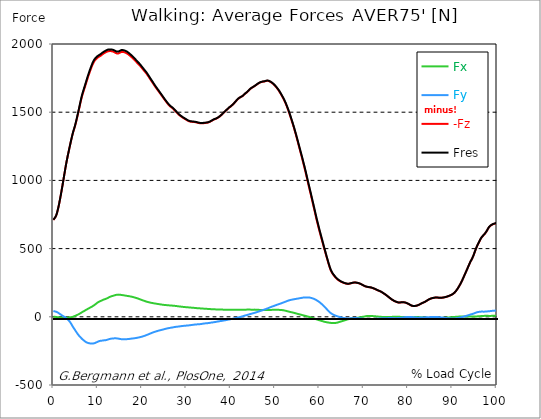
| Category |  Fx |  Fy |  -Fz |  Fres |
|---|---|---|---|---|
| 0.0 | 0.979 | 42.107 | 709.918 | 711.314 |
| 0.1646090534979424 | 0.453 | 40.911 | 717.196 | 718.51 |
| 0.3292181069958848 | -0.073 | 39.723 | 724.482 | 725.706 |
| 0.5041152263374485 | -0.58 | 38.382 | 732.703 | 733.826 |
| 0.668724279835391 | -1.169 | 36.669 | 745.355 | 746.379 |
| 0.8333333333333333 | -2.085 | 34.322 | 762.321 | 763.218 |
| 0.9979423868312757 | -3.1 | 31.258 | 783.664 | 784.434 |
| 1.162551440329218 | -4.133 | 27.914 | 806.965 | 807.609 |
| 1.337448559670782 | -5.075 | 24.135 | 833.71 | 834.245 |
| 1.5020576131687242 | -5.945 | 20.247 | 861.443 | 861.887 |
| 1.6666666666666665 | -6.435 | 16.286 | 890.798 | 891.143 |
| 1.831275720164609 | -6.815 | 12.561 | 921.404 | 921.676 |
| 1.9958847736625513 | -7.232 | 8.954 | 952.137 | 952.355 |
| 2.170781893004115 | -7.096 | 5.556 | 984.239 | 984.411 |
| 2.3353909465020575 | -6.942 | 2.42 | 1016.838 | 1016.992 |
| 2.4999999999999996 | -6.761 | -0.816 | 1048.74 | 1048.876 |
| 2.6646090534979425 | -6.625 | -4.133 | 1080.742 | 1080.887 |
| 2.829218106995885 | -6.426 | -7.658 | 1111.864 | 1112.028 |
| 3.0041152263374484 | -6.19 | -11.963 | 1140.939 | 1141.165 |
| 3.168724279835391 | -5.818 | -16.894 | 1168.237 | 1168.545 |
| 3.333333333333333 | -5.302 | -22.277 | 1193.794 | 1194.22 |
| 3.497942386831276 | -4.74 | -28.014 | 1218.863 | 1219.416 |
| 3.662551440329218 | -4.142 | -34.385 | 1243.94 | 1244.683 |
| 3.837448559670782 | -3.399 | -41.889 | 1268.682 | 1269.716 |
| 4.002057613168724 | -2.61 | -50.345 | 1292.681 | 1294.077 |
| 4.166666666666667 | -1.668 | -59.508 | 1315.557 | 1317.36 |
| 4.3312757201646095 | -0.562 | -69.015 | 1337.761 | 1339.972 |
| 4.495884773662552 | 1.069 | -78.124 | 1357.736 | 1360.401 |
| 4.670781893004115 | 3.362 | -86.253 | 1375.01 | 1378.164 |
| 4.835390946502058 | 5.646 | -94.383 | 1392.275 | 1395.928 |
| 4.999999999999999 | 8.075 | -102.567 | 1412.214 | 1416.41 |
| 5.164609053497943 | 10.477 | -110.741 | 1434.11 | 1438.85 |
| 5.329218106995885 | 12.815 | -118.907 | 1457.022 | 1462.324 |
| 5.504115226337448 | 15.462 | -126.529 | 1480.323 | 1486.205 |
| 5.668724279835391 | 18.135 | -133.734 | 1503.95 | 1510.385 |
| 5.833333333333333 | 21.017 | -140.369 | 1528.285 | 1535.245 |
| 5.997942386831276 | 24.044 | -146.695 | 1552.99 | 1560.449 |
| 6.162551440329218 | 27.679 | -151.924 | 1577.433 | 1585.355 |
| 6.337448559670782 | 31.032 | -157.616 | 1600.091 | 1608.529 |
| 6.502057613168724 | 34.304 | -163.126 | 1620.664 | 1629.573 |
| 6.666666666666666 | 37.566 | -167.811 | 1639.098 | 1648.433 |
| 6.831275720164609 | 40.648 | -172.261 | 1656.608 | 1666.351 |
| 6.995884773662552 | 43.539 | -176.53 | 1673.438 | 1683.571 |
| 7.170781893004115 | 46.729 | -180.971 | 1690.486 | 1700.999 |
| 7.3353909465020575 | 49.892 | -185.013 | 1707.697 | 1718.572 |
| 7.500000000000001 | 52.983 | -187.768 | 1725.379 | 1736.526 |
| 7.664609053497942 | 56.146 | -190.07 | 1742.961 | 1754.344 |
| 7.829218106995885 | 59.191 | -191.792 | 1759.719 | 1771.265 |
| 8.004115226337449 | 62.2 | -193.279 | 1775.57 | 1787.279 |
| 8.168724279835391 | 65.218 | -194.62 | 1791.158 | 1803.013 |
| 8.333333333333334 | 68.064 | -195.336 | 1806.285 | 1818.221 |
| 8.497942386831278 | 70.909 | -195.617 | 1820.976 | 1832.948 |
| 8.662551440329219 | 73.719 | -195.653 | 1835.314 | 1847.313 |
| 8.837448559670783 | 76.918 | -195.535 | 1848.219 | 1860.255 |
| 9.002057613168725 | 80.498 | -195.327 | 1859.802 | 1871.892 |
| 9.166666666666668 | 84.259 | -194.611 | 1870.116 | 1882.233 |
| 9.33127572016461 | 88.066 | -192.907 | 1878.191 | 1890.281 |
| 9.495884773662551 | 92.334 | -190.542 | 1884.472 | 1896.507 |
| 9.670781893004117 | 96.476 | -187.995 | 1890.209 | 1902.19 |
| 9.83539094650206 | 100.455 | -185.439 | 1895.755 | 1907.682 |
| 9.999999999999998 | 104.878 | -182.775 | 1900.323 | 1912.223 |
| 10.16460905349794 | 108.421 | -180.464 | 1904.311 | 1916.174 |
| 10.329218106995887 | 111.412 | -178.497 | 1907.465 | 1919.319 |
| 10.504115226337447 | 114.131 | -176.693 | 1910.202 | 1922.065 |
| 10.66872427983539 | 116.225 | -175.859 | 1913.836 | 1925.745 |
| 10.833333333333334 | 118.218 | -175.307 | 1917.978 | 1929.941 |
| 10.997942386831275 | 120.385 | -174.808 | 1922.727 | 1934.744 |
| 11.162551440329217 | 123.103 | -173.784 | 1926.778 | 1938.832 |
| 11.337448559670783 | 126.294 | -172.153 | 1930.222 | 1942.303 |
| 11.502057613168724 | 128.197 | -171.89 | 1932.161 | 1944.324 |
| 11.666666666666666 | 129.574 | -171.99 | 1936.367 | 1948.584 |
| 11.831275720164609 | 131.387 | -171.346 | 1939.965 | 1952.209 |
| 11.995884773662551 | 133.907 | -169.923 | 1942.693 | 1954.955 |
| 12.170781893004115 | 136.78 | -168.083 | 1944.759 | 1957.039 |
| 12.335390946502057 | 139.181 | -166.615 | 1946.572 | 1958.879 |
| 12.5 | 142.426 | -164.503 | 1947.668 | 1960.003 |
| 12.664609053497943 | 144.891 | -162.936 | 1948.176 | 1960.574 |
| 12.829218106995885 | 147.293 | -161.476 | 1948.248 | 1960.71 |
| 13.004115226337449 | 149.314 | -160.643 | 1947.85 | 1960.42 |
| 13.168724279835391 | 151.063 | -159.727 | 1946.871 | 1959.505 |
| 13.333333333333332 | 152.703 | -158.966 | 1945.629 | 1958.326 |
| 13.497942386831276 | 154.28 | -158.467 | 1943.907 | 1956.704 |
| 13.662551440329217 | 155.83 | -158.114 | 1941.841 | 1954.747 |
| 13.837448559670783 | 157.507 | -158.005 | 1938.85 | 1951.91 |
| 14.002057613168724 | 159.328 | -157.942 | 1935.424 | 1948.647 |
| 14.166666666666666 | 160.933 | -158.014 | 1932.488 | 1945.865 |
| 14.33127572016461 | 161.785 | -158.431 | 1930.53 | 1944.025 |
| 14.495884773662551 | 162.22 | -158.984 | 1930.14 | 1943.726 |
| 14.670781893004115 | 162.573 | -159.89 | 1931.065 | 1944.741 |
| 14.835390946502057 | 162.356 | -161.05 | 1933.149 | 1946.88 |
| 15.000000000000002 | 161.757 | -162.211 | 1936.113 | 1949.862 |
| 15.164609053497943 | 161.078 | -163.235 | 1939.357 | 1953.115 |
| 15.329218106995883 | 160.171 | -164.087 | 1941.442 | 1955.163 |
| 15.504115226337449 | 159.492 | -164.703 | 1942.049 | 1955.771 |
| 15.66872427983539 | 158.576 | -165.084 | 1941.904 | 1955.58 |
| 15.833333333333334 | 157.724 | -165.129 | 1941.125 | 1954.737 |
| 15.997942386831276 | 156.981 | -165.102 | 1939.557 | 1953.115 |
| 16.162551440329217 | 155.885 | -165.038 | 1937.645 | 1951.121 |
| 16.337448559670783 | 154.815 | -164.703 | 1935.361 | 1948.747 |
| 16.502057613168724 | 153.882 | -164.159 | 1932.886 | 1946.173 |
| 16.666666666666668 | 153.157 | -163.787 | 1929.714 | 1942.937 |
| 16.83127572016461 | 152.404 | -163.207 | 1925.899 | 1939.031 |
| 16.995884773662556 | 151.471 | -162.591 | 1921.775 | 1934.817 |
| 17.170781893004115 | 150.592 | -161.975 | 1917.253 | 1930.204 |
| 17.33539094650206 | 149.504 | -161.241 | 1912.612 | 1925.446 |
| 17.500000000000004 | 148.471 | -160.479 | 1908.036 | 1920.76 |
| 17.66460905349794 | 147.32 | -159.782 | 1903.296 | 1915.911 |
| 17.82921810699589 | 145.988 | -159.12 | 1898.447 | 1910.936 |
| 18.00411522633745 | 144.61 | -158.504 | 1893.444 | 1905.797 |
| 18.16872427983539 | 143.196 | -157.86 | 1888.36 | 1900.586 |
| 18.333333333333336 | 141.565 | -157.072 | 1882.695 | 1894.767 |
| 18.497942386831276 | 139.979 | -156.247 | 1876.65 | 1888.577 |
| 18.66255144032922 | 138.438 | -155.277 | 1870.469 | 1882.242 |
| 18.837448559670786 | 136.771 | -154.208 | 1864.551 | 1876.152 |
| 19.002057613168724 | 134.994 | -153.129 | 1858.923 | 1870.333 |
| 19.166666666666668 | 132.873 | -152.123 | 1853.793 | 1864.995 |
| 19.331275720164612 | 130.762 | -150.99 | 1848.274 | 1859.267 |
| 19.495884773662553 | 128.704 | -149.758 | 1842.274 | 1853.059 |
| 19.67078189300412 | 126.674 | -148.489 | 1835.975 | 1846.552 |
| 19.83539094650206 | 124.59 | -147.13 | 1829.513 | 1839.872 |
| 19.999999999999996 | 122.677 | -145.571 | 1822.807 | 1832.948 |
| 20.164609053497944 | 120.774 | -143.876 | 1815.991 | 1825.915 |
| 20.32921810699588 | 118.853 | -142.127 | 1809.348 | 1819.054 |
| 20.504115226337447 | 116.913 | -140.233 | 1802.641 | 1812.112 |
| 20.66872427983539 | 115.046 | -138.275 | 1796.388 | 1805.623 |
| 20.833333333333332 | 113.252 | -136.308 | 1790.252 | 1799.252 |
| 20.997942386831276 | 111.276 | -134.251 | 1783.437 | 1792.173 |
| 21.162551440329217 | 109.69 | -132.121 | 1775.932 | 1784.443 |
| 21.33744855967078 | 108.195 | -129.874 | 1767.839 | 1776.123 |
| 21.502057613168724 | 106.872 | -127.644 | 1759.818 | 1767.884 |
| 21.666666666666668 | 105.566 | -125.36 | 1751.489 | 1759.356 |
| 21.83127572016461 | 104.252 | -122.832 | 1742.898 | 1750.547 |
| 21.99588477366255 | 102.993 | -120.511 | 1734.596 | 1742.037 |
| 22.170781893004115 | 101.832 | -118.409 | 1726.693 | 1733.952 |
| 22.335390946502056 | 100.808 | -116.306 | 1718.853 | 1725.941 |
| 22.5 | 99.82 | -114.285 | 1710.842 | 1717.757 |
| 22.664609053497944 | 98.833 | -112.391 | 1702.63 | 1709.401 |
| 22.82921810699588 | 97.963 | -110.606 | 1694.528 | 1701.153 |
| 23.004115226337447 | 97.156 | -108.965 | 1686.58 | 1693.087 |
| 23.16872427983539 | 96.177 | -107.225 | 1678.559 | 1684.93 |
| 23.333333333333332 | 95.289 | -105.521 | 1671.019 | 1677.263 |
| 23.497942386831276 | 94.328 | -103.745 | 1664.258 | 1670.357 |
| 23.662551440329217 | 93.44 | -102.104 | 1656.681 | 1662.653 |
| 23.83744855967078 | 92.624 | -100.582 | 1648.959 | 1654.814 |
| 24.002057613168727 | 91.8 | -99.259 | 1641.555 | 1647.319 |
| 24.166666666666664 | 90.93 | -97.899 | 1634.114 | 1639.769 |
| 24.33127572016461 | 90.041 | -96.494 | 1626.691 | 1632.238 |
| 24.495884773662553 | 89.235 | -95.071 | 1619.024 | 1624.471 |
| 24.670781893004115 | 88.419 | -93.757 | 1611.511 | 1616.858 |
| 24.83539094650206 | 87.676 | -92.398 | 1603.961 | 1609.209 |
| 25.0 | 87.042 | -91.002 | 1596.421 | 1601.577 |
| 25.164609053497944 | 86.534 | -89.543 | 1588.916 | 1593.992 |
| 25.329218106995885 | 86.072 | -88.048 | 1581.467 | 1586.451 |
| 25.504115226337447 | 85.601 | -86.697 | 1574.307 | 1579.219 |
| 25.66872427983539 | 85.129 | -85.428 | 1567.355 | 1572.204 |
| 25.833333333333332 | 84.73 | -84.178 | 1560.703 | 1565.479 |
| 25.997942386831276 | 84.259 | -83.054 | 1554.296 | 1559.017 |
| 26.16255144032922 | 83.743 | -81.993 | 1548.341 | 1553.009 |
| 26.337448559670783 | 83.19 | -81.06 | 1542.903 | 1547.507 |
| 26.502057613168724 | 82.764 | -80.163 | 1538.861 | 1543.411 |
| 26.666666666666664 | 82.329 | -79.265 | 1534.828 | 1539.323 |
| 26.83127572016461 | 81.912 | -78.305 | 1530.65 | 1535.082 |
| 26.995884773662553 | 81.531 | -77.226 | 1526.209 | 1530.568 |
| 27.170781893004115 | 81.015 | -76.13 | 1520.88 | 1525.176 |
| 27.33539094650206 | 80.48 | -75.078 | 1515.107 | 1519.33 |
| 27.499999999999996 | 79.927 | -74.172 | 1509.506 | 1513.675 |
| 27.66460905349794 | 79.202 | -73.51 | 1503.787 | 1507.911 |
| 27.829218106995885 | 78.477 | -72.885 | 1497.951 | 1502.02 |
| 28.004115226337447 | 77.734 | -72.233 | 1491.951 | 1495.966 |
| 28.16872427983539 | 76.945 | -71.607 | 1486.214 | 1490.165 |
| 28.333333333333332 | 76.229 | -70.864 | 1480.867 | 1484.764 |
| 28.49794238683128 | 75.541 | -70.166 | 1476.48 | 1480.314 |
| 28.66255144032922 | 74.915 | -69.423 | 1472.347 | 1476.136 |
| 28.837448559670783 | 74.281 | -68.571 | 1468.45 | 1472.175 |
| 29.002057613168724 | 73.664 | -67.873 | 1464.653 | 1468.332 |
| 29.166666666666664 | 73.057 | -67.221 | 1460.901 | 1464.535 |
| 29.331275720164612 | 72.486 | -66.532 | 1457.33 | 1460.919 |
| 29.495884773662553 | 71.879 | -65.961 | 1454.013 | 1457.556 |
| 29.670781893004115 | 71.308 | -65.526 | 1450.823 | 1454.33 |
| 29.835390946502056 | 70.81 | -65.018 | 1447.66 | 1451.122 |
| 30.000000000000004 | 70.366 | -64.583 | 1444.37 | 1447.805 |
| 30.164609053497944 | 69.958 | -64.185 | 1440.708 | 1444.116 |
| 30.329218106995885 | 69.505 | -63.668 | 1437.618 | 1440.98 |
| 30.504115226337447 | 69.051 | -63.024 | 1434.935 | 1438.261 |
| 30.66872427983539 | 68.616 | -62.299 | 1432.724 | 1435.995 |
| 30.833333333333336 | 68.127 | -61.602 | 1431.292 | 1434.518 |
| 30.99794238683128 | 67.592 | -60.877 | 1430.349 | 1433.521 |
| 31.162551440329217 | 67.184 | -60.133 | 1429.697 | 1432.823 |
| 31.33744855967078 | 66.65 | -59.499 | 1429.216 | 1432.298 |
| 31.50205761316873 | 66.187 | -58.774 | 1428.818 | 1431.845 |
| 31.666666666666668 | 65.762 | -57.994 | 1428.355 | 1431.337 |
| 31.831275720164612 | 65.317 | -57.251 | 1427.685 | 1430.621 |
| 31.995884773662553 | 64.774 | -56.617 | 1426.851 | 1429.733 |
| 32.17078189300411 | 64.157 | -56.082 | 1425.872 | 1428.709 |
| 32.33539094650206 | 63.541 | -55.665 | 1424.676 | 1427.476 |
| 32.5 | 63.106 | -55.276 | 1423.307 | 1426.071 |
| 32.66460905349794 | 62.807 | -54.931 | 1421.649 | 1424.395 |
| 32.82921810699589 | 62.435 | -54.551 | 1420.235 | 1422.945 |
| 33.00411522633745 | 62 | -54.106 | 1419.283 | 1421.957 |
| 33.168724279835395 | 61.611 | -53.599 | 1418.658 | 1421.295 |
| 33.333333333333336 | 61.167 | -52.819 | 1418.495 | 1421.078 |
| 33.49794238683128 | 60.795 | -51.913 | 1418.558 | 1421.078 |
| 33.66255144032922 | 60.451 | -50.889 | 1418.73 | 1421.186 |
| 33.83744855967078 | 60.124 | -50.01 | 1419.129 | 1421.54 |
| 34.00205761316873 | 59.608 | -49.24 | 1419.809 | 1422.174 |
| 34.16666666666667 | 59.064 | -48.524 | 1420.552 | 1422.863 |
| 34.331275720164605 | 58.611 | -47.989 | 1421.286 | 1423.561 |
| 34.49588477366255 | 58.239 | -47.463 | 1422.011 | 1424.25 |
| 34.67078189300412 | 58.13 | -46.956 | 1422.673 | 1424.893 |
| 34.83539094650206 | 57.904 | -46.457 | 1423.679 | 1425.881 |
| 35.00000000000001 | 57.596 | -45.805 | 1425.147 | 1427.304 |
| 35.16460905349794 | 57.17 | -44.926 | 1427.395 | 1429.515 |
| 35.32921810699588 | 56.671 | -43.992 | 1430.041 | 1432.107 |
| 35.504115226337454 | 56.137 | -43.059 | 1432.959 | 1434.971 |
| 35.668724279835395 | 55.683 | -42.279 | 1436.023 | 1437.989 |
| 35.833333333333336 | 55.294 | -41.581 | 1439.177 | 1441.107 |
| 35.99794238683128 | 55.121 | -40.766 | 1442.512 | 1444.415 |
| 36.16255144032922 | 54.922 | -39.877 | 1445.24 | 1447.098 |
| 36.33744855967078 | 54.686 | -38.98 | 1447.75 | 1449.572 |
| 36.50205761316873 | 54.487 | -38.083 | 1449.889 | 1451.675 |
| 36.66666666666667 | 54.342 | -37.077 | 1451.729 | 1453.496 |
| 36.831275720164605 | 54.125 | -36.062 | 1454.294 | 1456.016 |
| 36.99588477366255 | 53.907 | -35.092 | 1457.221 | 1458.925 |
| 37.17078189300412 | 53.717 | -34.122 | 1460.384 | 1462.061 |
| 37.33539094650206 | 53.517 | -33.153 | 1463.946 | 1465.595 |
| 37.5 | 53.372 | -32.201 | 1468.033 | 1469.656 |
| 37.66460905349794 | 53.209 | -31.403 | 1472.393 | 1473.988 |
| 37.82921810699589 | 53.019 | -30.624 | 1476.897 | 1478.474 |
| 38.00411522633745 | 52.81 | -29.79 | 1482.226 | 1483.776 |
| 38.168724279835395 | 52.566 | -28.866 | 1488.489 | 1490.029 |
| 38.333333333333336 | 52.493 | -27.978 | 1493.981 | 1495.494 |
| 38.49794238683127 | 52.493 | -26.935 | 1498.839 | 1500.325 |
| 38.662551440329224 | 52.439 | -25.839 | 1503.678 | 1505.138 |
| 38.83744855967078 | 52.339 | -24.842 | 1508.826 | 1510.267 |
| 39.00205761316872 | 52.23 | -23.827 | 1513.865 | 1515.288 |
| 39.16666666666667 | 52.122 | -22.658 | 1518.895 | 1520.291 |
| 39.331275720164605 | 52.022 | -21.516 | 1523.844 | 1525.203 |
| 39.49588477366255 | 51.968 | -20.401 | 1528.901 | 1530.242 |
| 39.67078189300412 | 51.931 | -19.386 | 1534.012 | 1535.336 |
| 39.83539094650206 | 51.832 | -18.38 | 1538.363 | 1539.668 |
| 39.99999999999999 | 51.759 | -17.428 | 1541.924 | 1543.22 |
| 40.16460905349794 | 51.668 | -16.44 | 1546.257 | 1547.534 |
| 40.32921810699589 | 51.56 | -15.362 | 1551.241 | 1552.51 |
| 40.50411522633745 | 51.46 | -14.256 | 1556.371 | 1557.631 |
| 40.668724279835395 | 51.46 | -13.15 | 1561.827 | 1563.078 |
| 40.83333333333333 | 51.478 | -11.927 | 1567.809 | 1569.05 |
| 40.99794238683128 | 51.469 | -10.667 | 1573.745 | 1574.977 |
| 41.16255144032922 | 51.46 | -9.308 | 1579.926 | 1581.167 |
| 41.33744855967078 | 51.424 | -8.003 | 1586.306 | 1587.53 |
| 41.50205761316872 | 51.496 | -6.797 | 1592.261 | 1593.475 |
| 41.666666666666664 | 51.659 | -5.574 | 1597.617 | 1598.849 |
| 41.83127572016461 | 51.741 | -4.069 | 1602.185 | 1603.426 |
| 41.99588477366255 | 51.732 | -2.529 | 1605.901 | 1607.142 |
| 42.17078189300412 | 51.895 | -1.088 | 1609.082 | 1610.305 |
| 42.33539094650206 | 51.995 | 0.426 | 1611.9 | 1613.106 |
| 42.5 | 52.14 | 2.003 | 1614.556 | 1615.752 |
| 42.66460905349794 | 52.412 | 3.544 | 1617.746 | 1618.942 |
| 42.82921810699589 | 52.484 | 5.057 | 1622.441 | 1623.646 |
| 43.00411522633745 | 52.384 | 6.788 | 1628.042 | 1629.247 |
| 43.16872427983539 | 52.23 | 8.537 | 1633.488 | 1634.685 |
| 43.333333333333336 | 52.276 | 10.087 | 1637.875 | 1639.071 |
| 43.49794238683128 | 52.502 | 11.465 | 1641.79 | 1642.996 |
| 43.66255144032922 | 52.693 | 12.86 | 1645.841 | 1647.056 |
| 43.83744855967078 | 52.765 | 14.41 | 1650.69 | 1651.923 |
| 44.00205761316873 | 52.865 | 16.014 | 1656.463 | 1657.714 |
| 44.166666666666664 | 52.883 | 17.61 | 1662.59 | 1663.85 |
| 44.33127572016461 | 52.774 | 19.25 | 1668.218 | 1669.478 |
| 44.49588477366255 | 52.557 | 20.936 | 1672.795 | 1674.055 |
| 44.67078189300411 | 52.348 | 22.404 | 1676.81 | 1678.088 |
| 44.835390946502066 | 52.366 | 23.781 | 1680.209 | 1681.505 |
| 45.0 | 52.484 | 25.322 | 1683.172 | 1684.504 |
| 45.16460905349794 | 52.656 | 26.872 | 1686.308 | 1687.658 |
| 45.32921810699589 | 52.602 | 28.494 | 1690.006 | 1691.383 |
| 45.504115226337454 | 52.457 | 30.198 | 1693.703 | 1695.099 |
| 45.668724279835395 | 52.294 | 31.911 | 1697.41 | 1698.824 |
| 45.83333333333333 | 52.076 | 33.461 | 1701.289 | 1702.721 |
| 45.99794238683128 | 51.723 | 35.119 | 1705.186 | 1706.636 |
| 46.16255144032922 | 51.161 | 36.959 | 1709.111 | 1710.57 |
| 46.33744855967078 | 50.871 | 38.871 | 1712.718 | 1714.195 |
| 46.50205761316873 | 50.617 | 40.811 | 1715.844 | 1717.349 |
| 46.666666666666664 | 50.445 | 42.787 | 1718.228 | 1719.76 |
| 46.831275720164605 | 50.318 | 44.563 | 1719.896 | 1721.445 |
| 46.99588477366255 | 50.246 | 46.358 | 1721.717 | 1723.294 |
| 47.17078189300412 | 50.318 | 48.243 | 1723.158 | 1724.781 |
| 47.33539094650206 | 50.327 | 50.064 | 1723.974 | 1725.642 |
| 47.5 | 50.427 | 51.895 | 1724.436 | 1726.14 |
| 47.66460905349794 | 50.536 | 53.825 | 1725.361 | 1727.11 |
| 47.82921810699588 | 50.363 | 55.683 | 1727.282 | 1729.067 |
| 48.004115226337454 | 50.128 | 57.605 | 1729.149 | 1730.98 |
| 48.168724279835395 | 49.738 | 59.644 | 1730.572 | 1732.448 |
| 48.33333333333333 | 49.475 | 61.701 | 1730.835 | 1732.783 |
| 48.49794238683128 | 49.566 | 63.876 | 1729.493 | 1731.524 |
| 48.66255144032922 | 49.792 | 66.106 | 1727.409 | 1729.53 |
| 48.83744855967078 | 50.028 | 68.526 | 1724.699 | 1726.919 |
| 49.00205761316873 | 50.327 | 70.801 | 1721.681 | 1724.01 |
| 49.166666666666664 | 50.581 | 72.958 | 1718.119 | 1720.557 |
| 49.331275720164605 | 50.826 | 75.015 | 1714.322 | 1716.859 |
| 49.49588477366255 | 50.889 | 76.963 | 1709.827 | 1712.455 |
| 49.67078189300412 | 50.916 | 78.849 | 1705.078 | 1707.805 |
| 49.83539094650206 | 50.889 | 80.652 | 1700.002 | 1702.83 |
| 50.0 | 50.853 | 82.61 | 1693.894 | 1696.83 |
| 50.16460905349794 | 51.143 | 84.749 | 1687.64 | 1690.704 |
| 50.32921810699589 | 51.215 | 86.806 | 1681.305 | 1684.468 |
| 50.504115226337454 | 51.179 | 88.682 | 1674.408 | 1677.68 |
| 50.668724279835395 | 51.088 | 90.594 | 1666.886 | 1670.284 |
| 50.83333333333333 | 50.898 | 92.479 | 1659.11 | 1662.617 |
| 50.99794238683128 | 50.708 | 94.31 | 1650.944 | 1654.569 |
| 51.162551440329224 | 50.436 | 96.222 | 1641.808 | 1645.551 |
| 51.33744855967078 | 50.073 | 98.108 | 1632.573 | 1636.434 |
| 51.50205761316873 | 49.566 | 100.029 | 1623.075 | 1627.054 |
| 51.666666666666664 | 48.895 | 102.077 | 1613.133 | 1617.247 |
| 51.83127572016461 | 48.098 | 104.189 | 1603.127 | 1607.36 |
| 51.99588477366255 | 47.055 | 106.183 | 1592.397 | 1596.765 |
| 52.17078189300412 | 45.95 | 108.331 | 1581.213 | 1585.726 |
| 52.335390946502066 | 44.726 | 110.406 | 1569.25 | 1573.899 |
| 52.5 | 43.385 | 112.509 | 1556.344 | 1561.156 |
| 52.66460905349795 | 41.917 | 114.693 | 1542.314 | 1547.281 |
| 52.82921810699588 | 40.494 | 116.814 | 1527.958 | 1533.097 |
| 53.00411522633745 | 39.116 | 118.78 | 1513.358 | 1518.66 |
| 53.1687242798354 | 37.729 | 120.602 | 1498.059 | 1503.524 |
| 53.33333333333333 | 36.406 | 122.161 | 1481.972 | 1487.591 |
| 53.49794238683128 | 35.101 | 123.43 | 1465.251 | 1471.006 |
| 53.66255144032922 | 33.814 | 124.644 | 1448.448 | 1454.339 |
| 53.83744855967078 | 32.491 | 125.804 | 1431.038 | 1437.074 |
| 54.00205761316873 | 31.204 | 126.919 | 1414.054 | 1420.235 |
| 54.166666666666664 | 29.89 | 127.961 | 1396.281 | 1402.598 |
| 54.33127572016461 | 28.485 | 128.904 | 1378.219 | 1384.68 |
| 54.495884773662546 | 27.044 | 129.91 | 1359.413 | 1366.02 |
| 54.67078189300412 | 25.558 | 130.852 | 1339.927 | 1346.697 |
| 54.835390946502066 | 24.044 | 131.849 | 1320.17 | 1327.094 |
| 54.99999999999999 | 22.585 | 132.81 | 1299.923 | 1307.028 |
| 55.16460905349795 | 21.099 | 133.734 | 1279.631 | 1286.917 |
| 55.32921810699588 | 19.64 | 134.668 | 1258.704 | 1266.19 |
| 55.50411522633745 | 18.18 | 135.647 | 1238.176 | 1245.871 |
| 55.668724279835395 | 16.749 | 136.68 | 1217.449 | 1225.379 |
| 55.83333333333333 | 15.344 | 137.758 | 1196.849 | 1205.024 |
| 55.99794238683128 | 13.957 | 138.909 | 1176.828 | 1185.266 |
| 56.162551440329224 | 12.534 | 139.825 | 1156.083 | 1164.775 |
| 56.33744855967078 | 11.129 | 140.686 | 1134.721 | 1143.658 |
| 56.50205761316873 | 9.734 | 141.356 | 1112.87 | 1122.06 |
| 56.666666666666664 | 8.284 | 142.018 | 1091.21 | 1100.644 |
| 56.83127572016461 | 6.861 | 142.299 | 1068.652 | 1078.313 |
| 56.99588477366256 | 5.447 | 142.362 | 1045.369 | 1055.248 |
| 57.17078189300412 | 3.988 | 142.217 | 1021.859 | 1031.937 |
| 57.335390946502066 | 2.501 | 142.091 | 998.368 | 1008.645 |
| 57.49999999999999 | 1.015 | 141.927 | 975.103 | 985.58 |
| 57.66460905349794 | -0.498 | 141.565 | 951.757 | 962.415 |
| 57.829218106995896 | -2.03 | 140.849 | 928.718 | 939.521 |
| 58.00411522633745 | -3.652 | 139.834 | 906.106 | 917.018 |
| 58.168724279835395 | -5.347 | 138.411 | 883.086 | 894.07 |
| 58.33333333333333 | -7.105 | 136.78 | 859.884 | 870.914 |
| 58.49794238683128 | -8.882 | 134.985 | 836.447 | 847.495 |
| 58.662551440329224 | -10.676 | 133.127 | 813.119 | 824.185 |
| 58.83744855967078 | -12.516 | 131.034 | 789.8 | 800.857 |
| 59.00205761316873 | -14.383 | 128.496 | 766.263 | 777.247 |
| 59.16666666666666 | -16.241 | 125.614 | 742.346 | 753.221 |
| 59.33127572016461 | -18.054 | 122.542 | 719.017 | 729.757 |
| 59.49588477366256 | -19.893 | 119.152 | 696.632 | 707.163 |
| 59.67078189300411 | -21.679 | 115.635 | 674.744 | 685.058 |
| 59.835390946502066 | -23.464 | 111.965 | 653.328 | 663.397 |
| 60.00000000000001 | -25.177 | 108.068 | 632.492 | 642.28 |
| 60.16460905349794 | -26.863 | 103.999 | 612.472 | 621.934 |
| 60.32921810699589 | -28.476 | 99.449 | 592.497 | 601.596 |
| 60.50411522633745 | -30.117 | 94.618 | 572.595 | 581.304 |
| 60.66872427983539 | -31.73 | 89.561 | 552.629 | 560.921 |
| 60.833333333333336 | -33.361 | 84.459 | 532.672 | 540.548 |
| 60.99794238683128 | -34.983 | 79.302 | 512.942 | 520.401 |
| 61.162551440329224 | -36.424 | 73.873 | 493.411 | 500.462 |
| 61.33744855967078 | -37.766 | 68.254 | 474.016 | 480.65 |
| 61.50205761316872 | -38.989 | 62.408 | 454.857 | 461.065 |
| 61.66666666666667 | -39.968 | 56.454 | 435.67 | 441.498 |
| 61.831275720164605 | -40.856 | 50.572 | 416.71 | 422.184 |
| 61.99588477366256 | -41.799 | 44.808 | 397.959 | 403.106 |
| 62.17078189300411 | -42.814 | 39.261 | 379.842 | 384.69 |
| 62.33539094650205 | -43.702 | 34.077 | 362.876 | 367.489 |
| 62.50000000000001 | -44.572 | 29.12 | 347.133 | 351.538 |
| 62.66460905349794 | -45.107 | 25.222 | 334.97 | 339.239 |
| 62.82921810699589 | -45.478 | 21.479 | 324.53 | 328.672 |
| 63.00411522633746 | -45.75 | 18.126 | 315.032 | 319.083 |
| 63.16872427983539 | -45.723 | 15.498 | 307.491 | 311.497 |
| 63.333333333333336 | -45.569 | 13.051 | 300.631 | 304.582 |
| 63.49794238683128 | -45.297 | 10.622 | 293.915 | 297.794 |
| 63.662551440329224 | -44.907 | 8.256 | 287.408 | 291.214 |
| 63.83744855967079 | -44.264 | 6.099 | 281.535 | 285.241 |
| 64.00205761316873 | -43.122 | 4.368 | 276.577 | 280.13 |
| 64.16666666666667 | -41.699 | 2.701 | 272.227 | 275.589 |
| 64.3312757201646 | -40.05 | 1.006 | 268.294 | 271.448 |
| 64.49588477366255 | -38.273 | -0.662 | 264.668 | 267.632 |
| 64.67078189300412 | -36.497 | -2.347 | 261.279 | 264.052 |
| 64.83539094650206 | -34.811 | -3.915 | 258.116 | 260.708 |
| 65.0 | -33.098 | -5.347 | 255.243 | 257.663 |
| 65.16460905349794 | -31.503 | -6.444 | 252.977 | 255.252 |
| 65.32921810699588 | -29.854 | -7.604 | 250.675 | 252.805 |
| 65.50411522633745 | -28.132 | -8.637 | 248.563 | 250.521 |
| 65.66872427983539 | -26.41 | -9.444 | 246.705 | 248.518 |
| 65.83333333333334 | -24.633 | -10.123 | 245.101 | 246.778 |
| 65.99794238683127 | -22.893 | -10.722 | 243.606 | 245.156 |
| 66.16255144032922 | -21.171 | -11.211 | 242.246 | 243.66 |
| 66.33744855967079 | -19.449 | -11.664 | 241.367 | 242.672 |
| 66.50205761316873 | -17.827 | -11.999 | 241.005 | 242.219 |
| 66.66666666666667 | -16.468 | -11.827 | 241.775 | 242.908 |
| 66.8312757201646 | -15.244 | -11.619 | 242.899 | 243.941 |
| 66.99588477366255 | -14.166 | -11.129 | 244.313 | 245.273 |
| 67.17078189300412 | -13.16 | -10.658 | 245.971 | 246.859 |
| 67.33539094650206 | -12.317 | -10.386 | 247.521 | 248.337 |
| 67.5 | -11.519 | -10.078 | 248.971 | 249.723 |
| 67.66460905349794 | -10.821 | -9.688 | 250.24 | 250.929 |
| 67.8292181069959 | -10.296 | -9.571 | 250.856 | 251.5 |
| 68.00411522633746 | -9.743 | -9.407 | 251.092 | 251.69 |
| 68.16872427983539 | -9.117 | -9.253 | 251.047 | 251.599 |
| 68.33333333333334 | -8.347 | -9.353 | 250.285 | 250.811 |
| 68.49794238683127 | -7.531 | -9.589 | 249.297 | 249.796 |
| 68.66255144032921 | -6.689 | -9.897 | 248.219 | 248.699 |
| 68.83744855967078 | -5.982 | -10.323 | 246.742 | 247.213 |
| 69.00205761316872 | -4.767 | -10.839 | 244.911 | 245.391 |
| 69.16666666666667 | -3.516 | -11.419 | 242.953 | 243.452 |
| 69.33127572016461 | -2.447 | -11.99 | 240.597 | 241.15 |
| 69.49588477366255 | -1.432 | -12.697 | 237.824 | 238.422 |
| 69.67078189300412 | -0.68 | -13.431 | 234.778 | 235.413 |
| 69.83539094650206 | 0.118 | -14.202 | 231.597 | 232.295 |
| 70.00000000000001 | 1.069 | -14.945 | 228.588 | 229.341 |
| 70.16460905349794 | 1.994 | -15.634 | 225.897 | 226.685 |
| 70.32921810699588 | 3.136 | -16.259 | 223.495 | 224.329 |
| 70.50411522633745 | 4.387 | -16.558 | 221.655 | 222.516 |
| 70.66872427983539 | 5.266 | -16.903 | 220.006 | 220.921 |
| 70.83333333333333 | 5.773 | -17.02 | 218.737 | 219.67 |
| 70.99794238683128 | 6.308 | -17.057 | 217.704 | 218.664 |
| 71.16255144032922 | 6.562 | -16.957 | 216.942 | 217.912 |
| 71.33744855967079 | 6.707 | -16.83 | 216.353 | 217.332 |
| 71.50205761316873 | 6.598 | -16.658 | 215.538 | 216.498 |
| 71.66666666666667 | 6.181 | -16.431 | 214.441 | 215.374 |
| 71.83127572016461 | 5.755 | -16.295 | 213 | 213.915 |
| 71.99588477366255 | 5.338 | -16.25 | 211.196 | 212.121 |
| 72.17078189300412 | 4.985 | -16.196 | 208.849 | 209.764 |
| 72.33539094650205 | 4.577 | -15.869 | 206.701 | 207.58 |
| 72.5 | 4.051 | -15.407 | 204.644 | 205.468 |
| 72.66460905349795 | 3.535 | -15.153 | 202.115 | 202.904 |
| 72.82921810699588 | 3.018 | -14.918 | 199.333 | 200.094 |
| 73.00411522633746 | 2.429 | -14.492 | 196.587 | 197.285 |
| 73.1687242798354 | 1.885 | -14.039 | 194.203 | 194.865 |
| 73.33333333333334 | 1.332 | -13.413 | 192.182 | 192.771 |
| 73.49794238683127 | 0.788 | -12.815 | 190.088 | 190.623 |
| 73.66255144032921 | 0.245 | -12.29 | 187.796 | 188.303 |
| 73.83744855967078 | -0.199 | -11.845 | 185.321 | 185.802 |
| 74.00205761316873 | -0.553 | -11.447 | 182.72 | 183.182 |
| 74.16666666666667 | -0.752 | -11.202 | 179.294 | 179.766 |
| 74.33127572016461 | -0.888 | -11.075 | 175.651 | 176.14 |
| 74.49588477366255 | -0.97 | -11.12 | 171.899 | 172.416 |
| 74.67078189300412 | -1.115 | -10.966 | 168.265 | 168.808 |
| 74.83539094650207 | -1.269 | -10.703 | 164.585 | 165.147 |
| 75.0 | -1.432 | -10.395 | 160.851 | 161.413 |
| 75.16460905349794 | -1.541 | -10.105 | 156.999 | 157.579 |
| 75.32921810699588 | -1.559 | -9.852 | 152.749 | 153.338 |
| 75.50411522633745 | -1.477 | -9.625 | 148.199 | 148.797 |
| 75.6687242798354 | -1.341 | -9.552 | 143.668 | 144.284 |
| 75.83333333333333 | -1.205 | -9.507 | 139.254 | 139.888 |
| 75.99794238683128 | -1.106 | -9.462 | 135.166 | 135.81 |
| 76.16255144032922 | -0.943 | -9.498 | 131.215 | 131.886 |
| 76.33744855967079 | -0.707 | -9.543 | 127.399 | 128.106 |
| 76.50205761316873 | -0.417 | -9.634 | 123.602 | 124.336 |
| 76.66666666666667 | -0.127 | -9.752 | 120.04 | 120.801 |
| 76.83127572016461 | 0.1 | -9.897 | 117.031 | 117.829 |
| 76.99588477366254 | 0.1 | -9.824 | 114.512 | 115.327 |
| 77.17078189300412 | 0.145 | -9.888 | 112.019 | 112.853 |
| 77.33539094650206 | 0.19 | -9.852 | 109.636 | 110.488 |
| 77.5 | 0.227 | -9.752 | 107.524 | 108.376 |
| 77.66460905349794 | 0.245 | -9.634 | 105.639 | 106.482 |
| 77.82921810699588 | 0.227 | -9.543 | 104.397 | 105.222 |
| 78.00411522633745 | -0.054 | -9.054 | 104.144 | 104.878 |
| 78.1687242798354 | -0.399 | -8.447 | 104.515 | 105.177 |
| 78.33333333333334 | -0.752 | -7.84 | 105.249 | 105.838 |
| 78.49794238683127 | -1.16 | -7.142 | 105.884 | 106.409 |
| 78.66255144032921 | -1.695 | -6.263 | 106.337 | 106.79 |
| 78.83744855967078 | -2.166 | -5.338 | 106.554 | 106.962 |
| 79.00205761316873 | -2.601 | -4.423 | 106.509 | 106.899 |
| 79.16666666666667 | -3.063 | -3.734 | 105.721 | 106.11 |
| 79.33127572016461 | -3.435 | -3.245 | 104.56 | 104.968 |
| 79.49588477366257 | -3.734 | -2.819 | 103.138 | 103.554 |
| 79.67078189300412 | -3.897 | -2.356 | 101.044 | 101.461 |
| 79.83539094650207 | -4.078 | -1.849 | 98.633 | 99.032 |
| 79.99999999999999 | -4.106 | -1.568 | 96.186 | 96.594 |
| 80.16460905349794 | -4.078 | -1.305 | 93.549 | 93.957 |
| 80.32921810699588 | -3.942 | -1.323 | 90.431 | 90.848 |
| 80.50411522633745 | -3.752 | -1.459 | 87.268 | 87.685 |
| 80.66872427983539 | -3.444 | -1.785 | 84.096 | 84.504 |
| 80.83333333333333 | -3.163 | -2.112 | 81.395 | 81.803 |
| 80.99794238683128 | -2.882 | -2.574 | 79.845 | 80.253 |
| 81.16255144032922 | -2.665 | -3.19 | 79.166 | 79.574 |
| 81.33744855967079 | -2.438 | -3.834 | 78.93 | 79.329 |
| 81.50205761316873 | -2.266 | -4.504 | 79.111 | 79.519 |
| 81.66666666666666 | -2.112 | -5.211 | 79.637 | 80.054 |
| 81.83127572016461 | -2.13 | -5.637 | 80.561 | 80.987 |
| 81.99588477366255 | -2.148 | -6.036 | 81.903 | 82.356 |
| 82.1707818930041 | -2.248 | -6.335 | 83.688 | 84.16 |
| 82.33539094650206 | -2.529 | -6.335 | 85.927 | 86.389 |
| 82.5 | -2.909 | -6.027 | 88.474 | 88.909 |
| 82.66460905349794 | -3.199 | -5.963 | 91.174 | 91.591 |
| 82.8292181069959 | -3.516 | -5.927 | 93.993 | 94.401 |
| 83.00411522633745 | -3.979 | -5.728 | 97.092 | 97.482 |
| 83.1687242798354 | -4.387 | -5.601 | 100.056 | 100.455 |
| 83.33333333333333 | -4.722 | -5.411 | 102.576 | 102.974 |
| 83.49794238683127 | -5.084 | -5.112 | 104.533 | 104.932 |
| 83.66255144032922 | -5.483 | -4.713 | 106.5 | 106.89 |
| 83.83744855967078 | -5.927 | -4.314 | 109.409 | 109.79 |
| 84.00205761316873 | -6.408 | -3.897 | 112.636 | 113.025 |
| 84.16666666666667 | -6.915 | -3.671 | 116.234 | 116.632 |
| 84.33127572016461 | -7.405 | -3.498 | 119.886 | 120.294 |
| 84.49588477366257 | -7.84 | -3.236 | 123.221 | 123.638 |
| 84.67078189300412 | -8.275 | -2.909 | 126.248 | 126.665 |
| 84.83539094650206 | -8.61 | -2.628 | 128.967 | 129.393 |
| 85.0 | -8.963 | -2.311 | 131.469 | 131.904 |
| 85.16460905349794 | -9.29 | -2.048 | 133.644 | 134.097 |
| 85.32921810699588 | -9.534 | -1.912 | 135.447 | 135.919 |
| 85.50411522633745 | -9.716 | -1.794 | 136.897 | 137.387 |
| 85.66872427983539 | -9.924 | -1.767 | 137.958 | 138.465 |
| 85.83333333333334 | -10.123 | -1.604 | 139.027 | 139.544 |
| 85.99794238683128 | -10.259 | -1.278 | 140.106 | 140.64 |
| 86.16255144032922 | -10.178 | -1.269 | 140.795 | 141.329 |
| 86.33744855967078 | -10.132 | -1.378 | 141.03 | 141.583 |
| 86.50205761316873 | -10.024 | -1.514 | 141.012 | 141.565 |
| 86.66666666666667 | -9.888 | -1.74 | 140.695 | 141.266 |
| 86.8312757201646 | -9.643 | -2.148 | 140.051 | 140.613 |
| 86.99588477366255 | -9.317 | -2.837 | 139.426 | 139.979 |
| 87.17078189300412 | -8.963 | -3.68 | 138.964 | 139.508 |
| 87.33539094650206 | -8.673 | -4.341 | 138.946 | 139.499 |
| 87.5 | -8.392 | -4.831 | 139.127 | 139.689 |
| 87.66460905349794 | -8.021 | -5.483 | 139.544 | 140.097 |
| 87.8292181069959 | -7.622 | -6.163 | 140.305 | 140.858 |
| 88.00411522633746 | -7.25 | -6.679 | 141.32 | 141.864 |
| 88.1687242798354 | -6.806 | -7.26 | 142.335 | 142.897 |
| 88.33333333333333 | -6.399 | -7.876 | 143.495 | 144.066 |
| 88.49794238683127 | -6.099 | -8.61 | 144.737 | 145.326 |
| 88.66255144032922 | -5.782 | -9.262 | 146.314 | 146.921 |
| 88.83744855967079 | -5.483 | -9.842 | 148.063 | 148.688 |
| 89.00205761316872 | -5.03 | -10.404 | 149.867 | 150.519 |
| 89.16666666666667 | -4.64 | -10.948 | 151.942 | 152.622 |
| 89.33127572016461 | -4.214 | -11.193 | 154.126 | 154.806 |
| 89.49588477366255 | -3.689 | -11.474 | 156.238 | 156.909 |
| 89.67078189300413 | -3.281 | -11.782 | 158.758 | 159.428 |
| 89.83539094650206 | -2.791 | -12.117 | 161.286 | 161.948 |
| 90.0 | -2.248 | -12.398 | 164.213 | 164.866 |
| 90.16460905349794 | -1.794 | -12.525 | 167.966 | 168.609 |
| 90.32921810699588 | -1.423 | -12.516 | 172.234 | 172.851 |
| 90.50411522633745 | -1.033 | -12.362 | 176.911 | 177.491 |
| 90.66872427983539 | -0.643 | -12.009 | 182.557 | 183.11 |
| 90.83333333333334 | -0.118 | -11.51 | 189.264 | 189.753 |
| 90.99794238683127 | 0.317 | -10.794 | 196.587 | 197.031 |
| 91.16255144032922 | 0.68 | -9.806 | 204.462 | 204.87 |
| 91.33744855967079 | 1.042 | -8.646 | 213.018 | 213.371 |
| 91.50205761316873 | 1.414 | -7.495 | 222.117 | 222.435 |
| 91.66666666666666 | 1.804 | -6.344 | 231.552 | 231.824 |
| 91.8312757201646 | 2.202 | -5.03 | 241.168 | 241.413 |
| 91.99588477366255 | 2.456 | -3.58 | 251.5 | 251.708 |
| 92.17078189300412 | 2.365 | -2.075 | 262.838 | 263.019 |
| 92.33539094650206 | 2.184 | -0.634 | 274.547 | 274.701 |
| 92.5 | 2.003 | 0.961 | 286.746 | 286.882 |
| 92.66460905349794 | 1.84 | 2.52 | 299.099 | 299.235 |
| 92.8292181069959 | 1.686 | 3.951 | 311.289 | 311.434 |
| 93.00411522633746 | 1.668 | 5.528 | 323.533 | 323.696 |
| 93.1687242798354 | 1.668 | 6.969 | 335.605 | 335.786 |
| 93.33333333333333 | 1.622 | 8.556 | 347.894 | 348.112 |
| 93.49794238683128 | 1.559 | 10.16 | 360.32 | 360.583 |
| 93.66255144032921 | 1.477 | 11.972 | 373.153 | 373.461 |
| 93.83744855967079 | 1.468 | 13.866 | 385.542 | 385.914 |
| 94.00205761316872 | 1.595 | 15.761 | 397.56 | 398.004 |
| 94.16666666666667 | 1.84 | 17.51 | 408.599 | 409.106 |
| 94.33127572016461 | 2.248 | 18.634 | 418.178 | 418.731 |
| 94.49588477366255 | 2.51 | 20.147 | 428.836 | 429.444 |
| 94.67078189300412 | 2.655 | 21.996 | 440.981 | 441.661 |
| 94.83539094650206 | 2.746 | 23.791 | 454.258 | 455.002 |
| 95.0 | 2.619 | 26.183 | 469.176 | 470.01 |
| 95.16460905349794 | 2.538 | 28.449 | 484.13 | 485.073 |
| 95.32921810699588 | 2.556 | 30.47 | 498.404 | 499.438 |
| 95.50411522633745 | 2.764 | 32.4 | 511.374 | 512.507 |
| 95.66872427983539 | 3.127 | 34.231 | 523.636 | 524.86 |
| 95.83333333333334 | 3.462 | 35.083 | 534.367 | 535.626 |
| 95.99794238683128 | 3.87 | 36.089 | 545.496 | 546.792 |
| 96.16255144032922 | 4.35 | 36.923 | 556.218 | 557.55 |
| 96.33744855967079 | 4.803 | 37.521 | 566.794 | 568.136 |
| 96.50205761316873 | 5.202 | 37.92 | 576.419 | 577.77 |
| 96.66666666666666 | 5.628 | 38.128 | 584.087 | 585.428 |
| 96.83127572016461 | 6.009 | 37.992 | 590.784 | 592.107 |
| 96.99588477366255 | 6.399 | 37.847 | 596.757 | 598.053 |
| 97.17078189300412 | 6.761 | 37.811 | 602.611 | 603.889 |
| 97.33539094650206 | 7.069 | 37.902 | 608.43 | 609.708 |
| 97.5 | 7.26 | 38.21 | 615.037 | 616.315 |
| 97.66460905349795 | 7.359 | 38.781 | 623.13 | 624.435 |
| 97.8292181069959 | 7.314 | 39.343 | 632.338 | 633.652 |
| 98.00411522633746 | 7.151 | 39.859 | 642 | 643.332 |
| 98.1687242798354 | 6.806 | 40.602 | 651.362 | 652.721 |
| 98.33333333333333 | 6.462 | 41.101 | 659.02 | 660.388 |
| 98.49794238683128 | 6.362 | 41.599 | 665.056 | 666.461 |
| 98.66255144032921 | 6.589 | 42.098 | 669.026 | 670.467 |
| 98.83744855967078 | 6.951 | 42.986 | 672.678 | 674.173 |
| 99.00205761316873 | 7.178 | 43.711 | 675.832 | 677.373 |
| 99.16666666666667 | 7.287 | 44.228 | 678.279 | 679.847 |
| 99.33127572016461 | 7.386 | 44.681 | 680.617 | 682.203 |
| 99.49588477366255 | 7.495 | 45.152 | 682.584 | 684.197 |
| 99.67078189300412 | 7.45 | 45.397 | 683.535 | 685.158 |
| 99.83539094650207 | 7.386 | 45.678 | 684.777 | 686.418 |
| 100.0 | 7.305 | 46.067 | 687.206 | 688.874 |